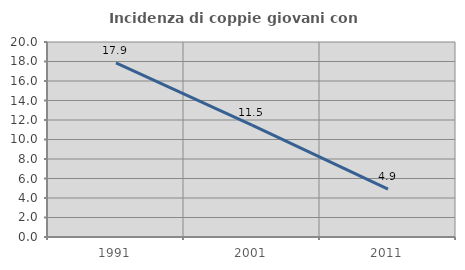
| Category | Incidenza di coppie giovani con figli |
|---|---|
| 1991.0 | 17.857 |
| 2001.0 | 11.483 |
| 2011.0 | 4.911 |